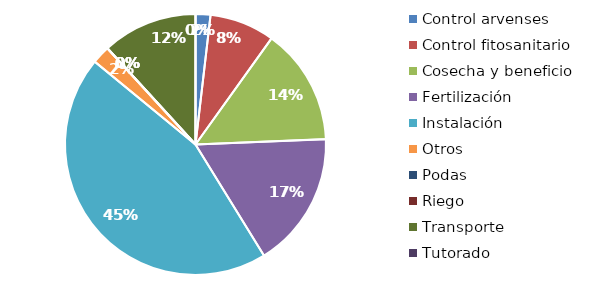
| Category | Valor |
|---|---|
| Control arvenses | 263763 |
| Control fitosanitario | 1152593 |
| Cosecha y beneficio | 2066827.92 |
| Fertilización | 2412376 |
| Instalación | 6402019.088 |
| Otros | 321507 |
| Podas | 0 |
| Riego | 0 |
| Transporte | 1688039 |
| Tutorado | 0 |